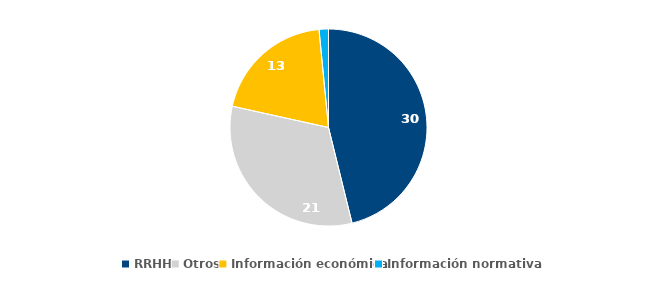
| Category | 2021 |
|---|---|
| RRHH | 30 |
| Otros | 21 |
| Información económica | 13 |
| Información normativa | 1 |